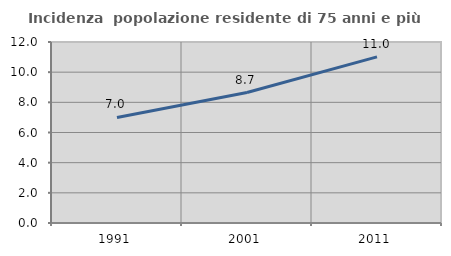
| Category | Incidenza  popolazione residente di 75 anni e più |
|---|---|
| 1991.0 | 6.997 |
| 2001.0 | 8.652 |
| 2011.0 | 11.012 |